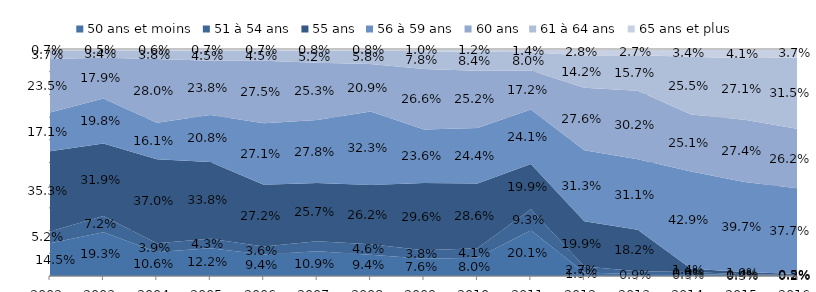
| Category | 50 ans et moins | 51 à 54 ans | 55 ans | 56 à 59 ans | 60 ans | 61 à 64 ans | 65 ans et plus |
|---|---|---|---|---|---|---|---|
| 2002.0 | 0.145 | 0.052 | 0.353 | 0.171 | 0.235 | 0.037 | 0.007 |
| 2003.0 | 0.193 | 0.072 | 0.319 | 0.198 | 0.179 | 0.034 | 0.005 |
| 2004.0 | 0.106 | 0.039 | 0.37 | 0.161 | 0.28 | 0.038 | 0.006 |
| 2005.0 | 0.122 | 0.043 | 0.338 | 0.208 | 0.238 | 0.045 | 0.007 |
| 2006.0 | 0.094 | 0.036 | 0.272 | 0.271 | 0.275 | 0.045 | 0.007 |
| 2007.0 | 0.109 | 0.043 | 0.257 | 0.278 | 0.253 | 0.052 | 0.008 |
| 2008.0 | 0.094 | 0.046 | 0.262 | 0.323 | 0.209 | 0.058 | 0.008 |
| 2009.0 | 0.076 | 0.038 | 0.296 | 0.236 | 0.266 | 0.078 | 0.01 |
| 2010.0 | 0.08 | 0.041 | 0.286 | 0.244 | 0.252 | 0.084 | 0.012 |
| 2011.0 | 0.201 | 0.093 | 0.199 | 0.241 | 0.172 | 0.08 | 0.014 |
| 2012.0 | 0.015 | 0.027 | 0.199 | 0.313 | 0.276 | 0.142 | 0.028 |
| 2013.0 | 0.009 | 0.012 | 0.182 | 0.311 | 0.302 | 0.157 | 0.027 |
| 2014.0 | 0.009 | 0.009 | 0.014 | 0.429 | 0.251 | 0.255 | 0.034 |
| 2015.0 | 0.003 | 0.004 | 0.01 | 0.397 | 0.274 | 0.271 | 0.041 |
| 2016.0 | 0.002 | 0.002 | 0.005 | 0.377 | 0.262 | 0.315 | 0.037 |